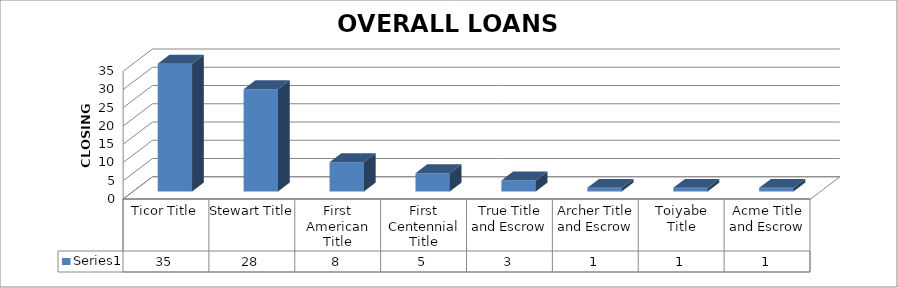
| Category | Series 0 |
|---|---|
| Ticor Title | 35 |
| Stewart Title | 28 |
| First American Title | 8 |
| First Centennial Title | 5 |
| True Title and Escrow | 3 |
| Archer Title and Escrow | 1 |
| Toiyabe Title | 1 |
| Acme Title and Escrow | 1 |